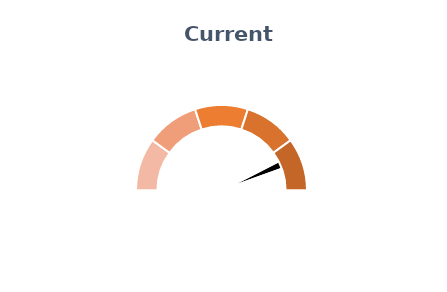
| Category | Pointer |
|---|---|
| 0 | 0.85 |
| 1 | 0.04 |
| 2 | 1.11 |